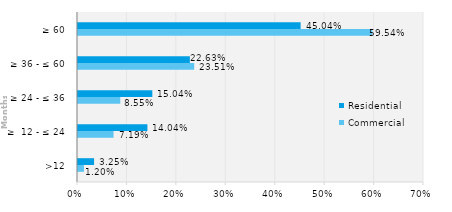
| Category | Commercial | Residential |
|---|---|---|
| >12 | 0.012 | 0.033 |
| ≥  12 - ≤ 24 | 0.072 | 0.14 |
| ≥ 24 - ≤ 36 | 0.086 | 0.15 |
| ≥ 36 - ≤ 60 | 0.235 | 0.226 |
| ≥ 60 | 0.595 | 0.45 |